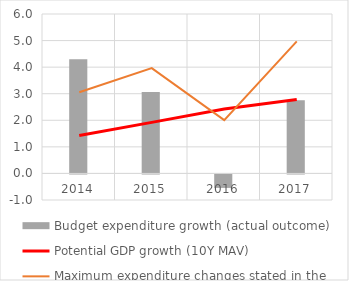
| Category | Budget expenditure growth (actual outcome) |
|---|---|
| 2014.0 | 4.294 |
| 2015.0 | 3.067 |
| 2016.0 | -0.508 |
| 2017.0 | 2.754 |